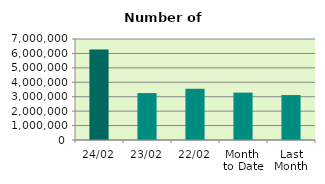
| Category | Series 0 |
|---|---|
| 24/02 | 6271176 |
| 23/02 | 3251338 |
| 22/02 | 3543594 |
| Month 
to Date | 3284369.889 |
| Last
Month | 3115708.381 |